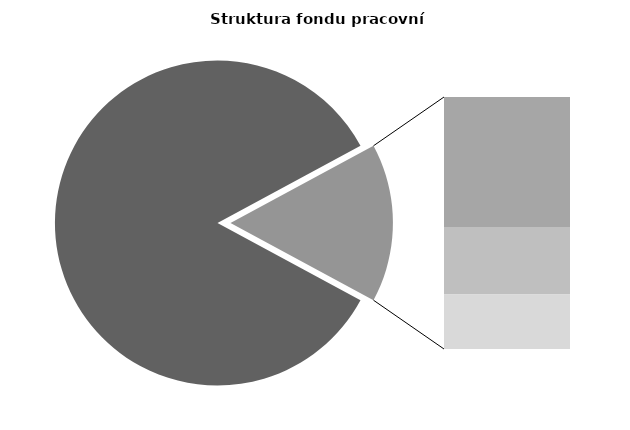
| Category | Series 0 |
|---|---|
| Průměrná měsíční odpracovaná doba bez přesčasu | 142.99 |
| Dovolená | 13.81 |
| Nemoc | 7.165 |
| Jiné | 5.774 |